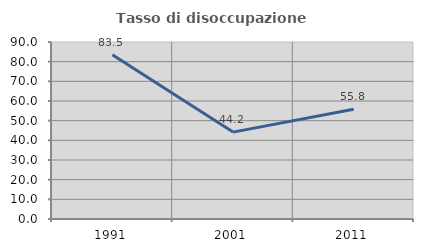
| Category | Tasso di disoccupazione giovanile  |
|---|---|
| 1991.0 | 83.476 |
| 2001.0 | 44.186 |
| 2011.0 | 55.844 |